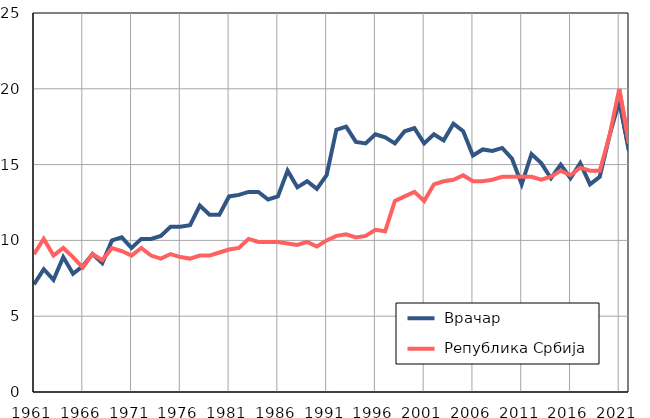
| Category |  Врачар |  Република Србија |
|---|---|---|
| 1961.0 | 7.1 | 9.1 |
| 1962.0 | 8.1 | 10.1 |
| 1963.0 | 7.4 | 9 |
| 1964.0 | 8.9 | 9.5 |
| 1965.0 | 7.8 | 8.9 |
| 1966.0 | 8.3 | 8.2 |
| 1967.0 | 9.1 | 9.1 |
| 1968.0 | 8.5 | 8.7 |
| 1969.0 | 10 | 9.5 |
| 1970.0 | 10.2 | 9.3 |
| 1971.0 | 9.5 | 9 |
| 1972.0 | 10.1 | 9.5 |
| 1973.0 | 10.1 | 9 |
| 1974.0 | 10.3 | 8.8 |
| 1975.0 | 10.9 | 9.1 |
| 1976.0 | 10.9 | 8.9 |
| 1977.0 | 11 | 8.8 |
| 1978.0 | 12.3 | 9 |
| 1979.0 | 11.7 | 9 |
| 1980.0 | 11.7 | 9.2 |
| 1981.0 | 12.9 | 9.4 |
| 1982.0 | 13 | 9.5 |
| 1983.0 | 13.2 | 10.1 |
| 1984.0 | 13.2 | 9.9 |
| 1985.0 | 12.7 | 9.9 |
| 1986.0 | 12.9 | 9.9 |
| 1987.0 | 14.6 | 9.8 |
| 1988.0 | 13.5 | 9.7 |
| 1989.0 | 13.9 | 9.9 |
| 1990.0 | 13.4 | 9.6 |
| 1991.0 | 14.3 | 10 |
| 1992.0 | 17.3 | 10.3 |
| 1993.0 | 17.5 | 10.4 |
| 1994.0 | 16.5 | 10.2 |
| 1995.0 | 16.4 | 10.3 |
| 1996.0 | 17 | 10.7 |
| 1997.0 | 16.8 | 10.6 |
| 1998.0 | 16.4 | 12.6 |
| 1999.0 | 17.2 | 12.9 |
| 2000.0 | 17.4 | 13.2 |
| 2001.0 | 16.4 | 12.6 |
| 2002.0 | 17 | 13.7 |
| 2003.0 | 16.6 | 13.9 |
| 2004.0 | 17.7 | 14 |
| 2005.0 | 17.2 | 14.3 |
| 2006.0 | 15.6 | 13.9 |
| 2007.0 | 16 | 13.9 |
| 2008.0 | 15.9 | 14 |
| 2009.0 | 16.1 | 14.2 |
| 2010.0 | 15.4 | 14.2 |
| 2011.0 | 13.7 | 14.2 |
| 2012.0 | 15.7 | 14.2 |
| 2013.0 | 15.1 | 14 |
| 2014.0 | 14.1 | 14.2 |
| 2015.0 | 15 | 14.6 |
| 2016.0 | 14.1 | 14.3 |
| 2017.0 | 15.1 | 14.8 |
| 2018.0 | 13.7 | 14.6 |
| 2019.0 | 14.2 | 14.6 |
| 2020.0 | 16.9 | 16.9 |
| 2021.0 | 19.2 | 20 |
| 2022.0 | 15.9 | 16.4 |